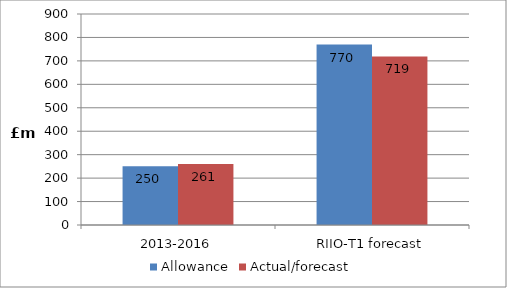
| Category | Allowance | Actual/forecast |
|---|---|---|
| 2013-2016 | 250.192 | 260.616 |
| RIIO-T1 forecast | 769.745 | 718.851 |